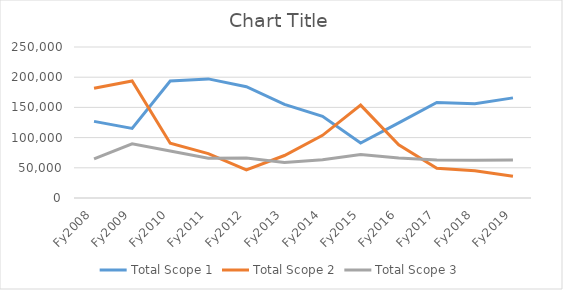
| Category | Total Scope 1 | Total Scope 2 | Total Scope 3 |
|---|---|---|---|
| Fy2008 | 126841.479 | 181813.637 | 64917.259 |
| Fy2009 | 115278.578 | 193713.774 | 89576.774 |
| Fy2010 | 193741.435 | 90726.787 | 77927.415 |
| Fy2011 | 197177.881 | 73417.408 | 65885.044 |
| Fy2012 | 184325.593 | 46376.878 | 66140.007 |
| Fy2013 | 155011.105 | 70341.459 | 58761.069 |
| Fy2014 | 135143.126 | 103753.189 | 63230.758 |
| Fy2015 | 90899.518 | 153815.412 | 72195.911 |
| Fy2016 | 124318.222 | 87985.115 | 66412.986 |
| Fy2017 | 158260.304 | 49213.723 | 62853.882 |
| Fy2018 | 156163.634 | 45161.345 | 62574.903 |
| Fy2019 | 165769.049 | 35843.633 | 62863.779 |